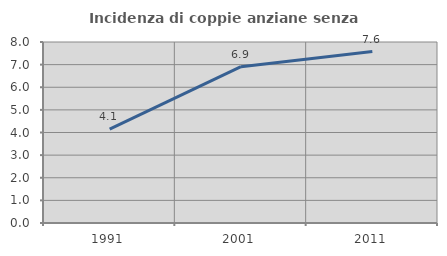
| Category | Incidenza di coppie anziane senza figli  |
|---|---|
| 1991.0 | 4.146 |
| 2001.0 | 6.908 |
| 2011.0 | 7.576 |